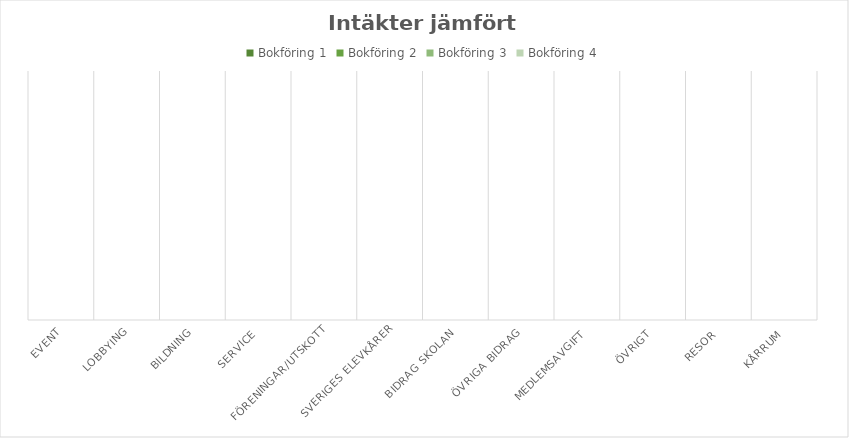
| Category | Bokföring 1 | Bokföring 2 | Bokföring 3 | Bokföring 4 |
|---|---|---|---|---|
| Event | 0 | 0 | 0 | 0 |
| Lobbying | 0 | 0 | 0 | 0 |
| Bildning | 0 | 0 | 0 | 0 |
| Service | 0 | 0 | 0 | 0 |
| Föreningar/Utskott | 0 | 0 | 0 | 0 |
| Sveriges Elevkårer | 0 | 0 | 0 | 0 |
| Bidrag skolan | 0 | 0 | 0 | 0 |
| Övriga bidrag | 0 | 0 | 0 | 0 |
| Medlemsavgift | 0 | 0 | 0 | 0 |
| Övrigt | 0 | 0 | 0 | 0 |
| Resor | 0 | 0 | 0 | 0 |
| Kårrum | 0 | 0 | 0 | 0 |